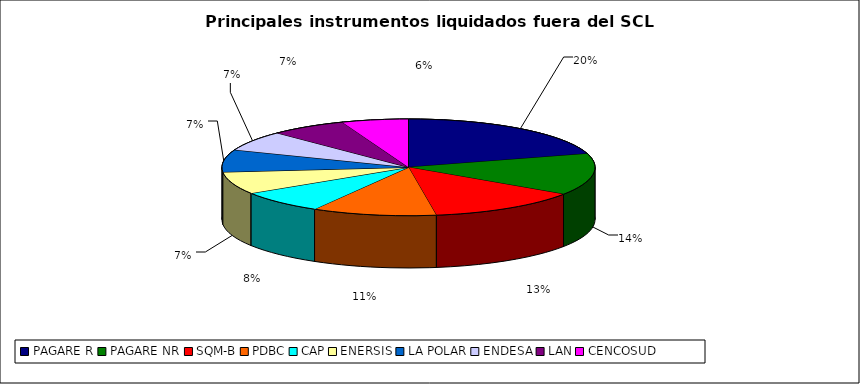
| Category | Series 0 |
|---|---|
| PAGARE R | 1819 |
| PAGARE NR | 1237 |
| SQM-B | 1176 |
| PDBC | 958 |
| CAP | 674 |
| ENERSIS | 663 |
| LA POLAR | 663 |
| ENDESA | 593 |
| LAN | 591 |
| CENCOSUD | 513 |